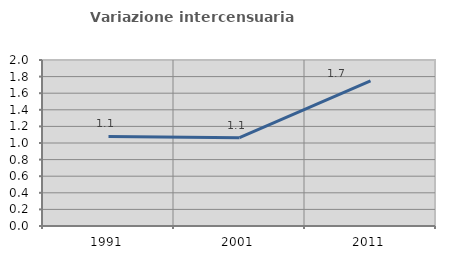
| Category | Variazione intercensuaria annua |
|---|---|
| 1991.0 | 1.08 |
| 2001.0 | 1.064 |
| 2011.0 | 1.748 |